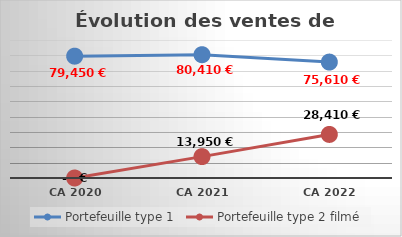
| Category | Portefeuille type 1 | Portefeuille type 2 filmé |
|---|---|---|
| CA 2020 | 79450 | 0 |
| CA 2021 | 80410 | 13950 |
| CA 2022 | 75610 | 28410 |